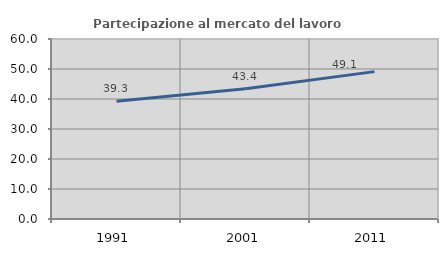
| Category | Partecipazione al mercato del lavoro  femminile |
|---|---|
| 1991.0 | 39.266 |
| 2001.0 | 43.412 |
| 2011.0 | 49.127 |